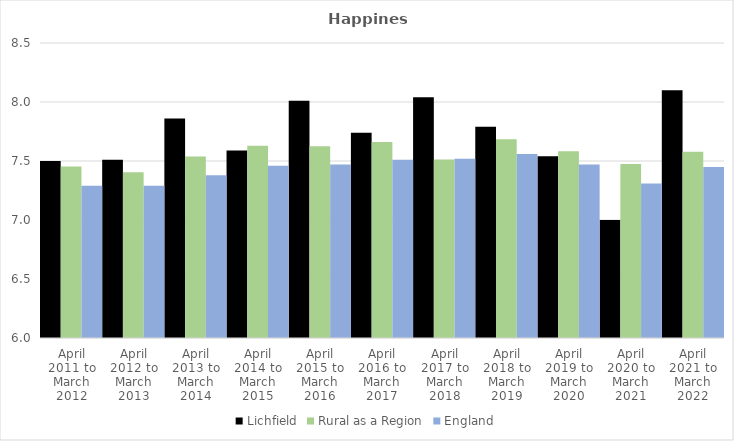
| Category | Lichfield | Rural as a Region | England |
|---|---|---|---|
| April 2011 to March 2012 | 7.5 | 7.454 | 7.29 |
| April 2012 to March 2013 | 7.51 | 7.406 | 7.29 |
| April 2013 to March 2014 | 7.86 | 7.539 | 7.38 |
| April 2014 to March 2015 | 7.59 | 7.63 | 7.46 |
| April 2015 to March 2016 | 8.01 | 7.625 | 7.47 |
| April 2016 to March 2017 | 7.74 | 7.661 | 7.51 |
| April 2017 to March 2018 | 8.04 | 7.513 | 7.52 |
| April 2018 to March 2019 | 7.79 | 7.684 | 7.56 |
| April 2019 to March 2020 | 7.54 | 7.582 | 7.47 |
| April 2020 to March 2021 | 7 | 7.474 | 7.31 |
| April 2021 to March 2022 | 8.1 | 7.577 | 7.45 |